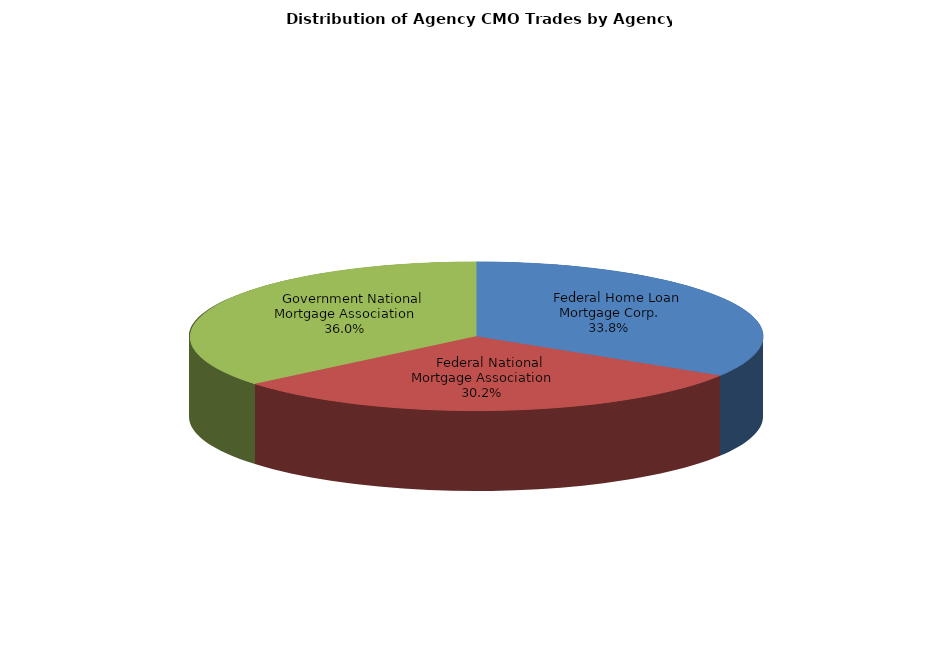
| Category | Series 0 |
|---|---|
|     Federal Home Loan Mortgage Corp. | 387 |
|     Federal National Mortgage Association | 345 |
|     Government National Mortgage Association | 412 |